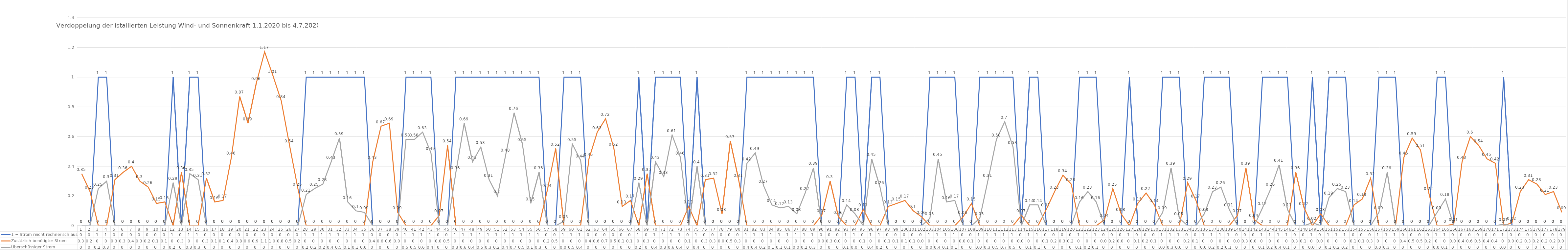
| Category | 1 = Strom reicht rechnerisch aus | Zusätzlich benötigter Strom | Überschüssiger Strom |
|---|---|---|---|
| 0 | 0 | 0.35 | 0 |
| 1 | 0 | 0.23 | 0 |
| 2 | 1 | 0 | 0.25 |
| 3 | 1 | 0 | 0.3 |
| 4 | 0 | 0.31 | 0 |
| 5 | 0 | 0.36 | 0 |
| 6 | 0 | 0.4 | 0 |
| 7 | 0 | 0.3 | 0 |
| 8 | 0 | 0.26 | 0 |
| 9 | 0 | 0.15 | 0 |
| 10 | 0 | 0.16 | 0 |
| 11 | 1 | 0 | 0.29 |
| 12 | 0 | 0.36 | 0 |
| 13 | 1 | 0 | 0.35 |
| 14 | 1 | 0 | 0.31 |
| 15 | 0 | 0.32 | 0 |
| 16 | 0 | 0.16 | 0 |
| 17 | 0 | 0.17 | 0 |
| 18 | 0 | 0.46 | 0 |
| 19 | 0 | 0.87 | 0 |
| 20 | 0 | 0.69 | 0 |
| 21 | 0 | 0.96 | 0 |
| 22 | 0 | 1.17 | 0 |
| 23 | 0 | 1.01 | 0 |
| 24 | 0 | 0.84 | 0 |
| 25 | 0 | 0.54 | 0 |
| 26 | 0 | 0.25 | 0 |
| 27 | 1 | 0 | 0.21 |
| 28 | 1 | 0 | 0.25 |
| 29 | 1 | 0 | 0.28 |
| 30 | 1 | 0 | 0.43 |
| 31 | 1 | 0 | 0.59 |
| 32 | 1 | 0 | 0.16 |
| 33 | 1 | 0 | 0.1 |
| 34 | 1 | 0 | 0.09 |
| 35 | 0 | 0.43 | 0 |
| 36 | 0 | 0.67 | 0 |
| 37 | 0 | 0.69 | 0 |
| 38 | 0 | 0.09 | 0 |
| 39 | 1 | 0 | 0.58 |
| 40 | 1 | 0 | 0.58 |
| 41 | 1 | 0 | 0.63 |
| 42 | 1 | 0 | 0.49 |
| 43 | 0 | 0.07 | 0 |
| 44 | 0 | 0.54 | 0 |
| 45 | 1 | 0 | 0.36 |
| 46 | 1 | 0 | 0.69 |
| 47 | 1 | 0 | 0.43 |
| 48 | 1 | 0 | 0.53 |
| 49 | 1 | 0 | 0.31 |
| 50 | 1 | 0 | 0.2 |
| 51 | 1 | 0 | 0.48 |
| 52 | 1 | 0 | 0.76 |
| 53 | 1 | 0 | 0.55 |
| 54 | 1 | 0 | 0.15 |
| 55 | 1 | 0 | 0.36 |
| 56 | 0 | 0.24 | 0 |
| 57 | 0 | 0.52 | 0 |
| 58 | 1 | 0 | 0.03 |
| 59 | 1 | 0 | 0.55 |
| 60 | 1 | 0 | 0.44 |
| 61 | 0 | 0.45 | 0 |
| 62 | 0 | 0.63 | 0 |
| 63 | 0 | 0.72 | 0 |
| 64 | 0 | 0.52 | 0 |
| 65 | 0 | 0.13 | 0 |
| 66 | 0 | 0.17 | 0 |
| 67 | 1 | 0 | 0.29 |
| 68 | 0 | 0.35 | 0 |
| 69 | 1 | 0 | 0.43 |
| 70 | 1 | 0 | 0.33 |
| 71 | 1 | 0 | 0.61 |
| 72 | 1 | 0 | 0.46 |
| 73 | 0 | 0.13 | 0 |
| 74 | 1 | 0 | 0.4 |
| 75 | 0 | 0.31 | 0 |
| 76 | 0 | 0.32 | 0 |
| 77 | 0 | 0.08 | 0 |
| 78 | 0 | 0.57 | 0 |
| 79 | 0 | 0.31 | 0 |
| 80 | 1 | 0 | 0.42 |
| 81 | 1 | 0 | 0.49 |
| 82 | 1 | 0 | 0.27 |
| 83 | 1 | 0 | 0.14 |
| 84 | 1 | 0 | 0.12 |
| 85 | 1 | 0 | 0.13 |
| 86 | 1 | 0 | 0.08 |
| 87 | 1 | 0 | 0.22 |
| 88 | 1 | 0 | 0.39 |
| 89 | 0 | 0.07 | 0 |
| 90 | 0 | 0.3 | 0 |
| 91 | 0 | 0.06 | 0 |
| 92 | 1 | 0 | 0.14 |
| 93 | 1 | 0 | 0.08 |
| 94 | 0 | 0.11 | 0 |
| 95 | 1 | 0 | 0.45 |
| 96 | 1 | 0 | 0.26 |
| 97 | 0 | 0.13 | 0 |
| 98 | 0 | 0.15 | 0 |
| 99 | 0 | 0.17 | 0 |
| 100 | 0 | 0.1 | 0 |
| 101 | 0 | 0.06 | 0 |
| 102 | 1 | 0 | 0.05 |
| 103 | 1 | 0 | 0.45 |
| 104 | 1 | 0 | 0.16 |
| 105 | 1 | 0 | 0.17 |
| 106 | 0 | 0.06 | 0 |
| 107 | 0 | 0.15 | 0 |
| 108 | 1 | 0 | 0.05 |
| 109 | 1 | 0 | 0.31 |
| 110 | 1 | 0 | 0.58 |
| 111 | 1 | 0 | 0.7 |
| 112 | 1 | 0 | 0.53 |
| 113 | 0 | 0.07 | 0 |
| 114 | 1 | 0 | 0.14 |
| 115 | 1 | 0 | 0.14 |
| 116 | 0 | 0.11 | 0 |
| 117 | 0 | 0.23 | 0 |
| 118 | 0 | 0.34 | 0 |
| 119 | 0 | 0.28 | 0 |
| 120 | 1 | 0 | 0.16 |
| 121 | 1 | 0 | 0.23 |
| 122 | 1 | 0 | 0.16 |
| 123 | 0 | 0.04 | 0 |
| 124 | 0 | 0.25 | 0 |
| 125 | 0 | 0.08 | 0 |
| 126 | 1 | 0 | 0 |
| 127 | 0 | 0.15 | 0 |
| 128 | 0 | 0.22 | 0 |
| 129 | 0 | 0.14 | 0 |
| 130 | 1 | 0 | 0.09 |
| 131 | 1 | 0 | 0.39 |
| 132 | 1 | 0 | 0.05 |
| 133 | 0 | 0.29 | 0 |
| 134 | 0 | 0.17 | 0 |
| 135 | 1 | 0 | 0.08 |
| 136 | 1 | 0 | 0.23 |
| 137 | 1 | 0 | 0.26 |
| 138 | 1 | 0 | 0.11 |
| 139 | 0 | 0.07 | 0 |
| 140 | 0 | 0.39 | 0 |
| 141 | 0 | 0.04 | 0 |
| 142 | 1 | 0 | 0.12 |
| 143 | 1 | 0 | 0.25 |
| 144 | 1 | 0 | 0.41 |
| 145 | 1 | 0 | 0.11 |
| 146 | 0 | 0.36 | 0 |
| 147 | 0 | 0.12 | 0 |
| 148 | 1 | 0 | 0.02 |
| 149 | 0 | 0.08 | 0 |
| 150 | 1 | 0 | 0.19 |
| 151 | 1 | 0 | 0.25 |
| 152 | 1 | 0 | 0.23 |
| 153 | 0 | 0.14 | 0 |
| 154 | 0 | 0.18 | 0 |
| 155 | 0 | 0.32 | 0 |
| 156 | 1 | 0 | 0.09 |
| 157 | 1 | 0 | 0.36 |
| 158 | 1 | 0 | 0 |
| 159 | 0 | 0.46 | 0 |
| 160 | 0 | 0.59 | 0 |
| 161 | 0 | 0.51 | 0 |
| 162 | 0 | 0.22 | 0 |
| 163 | 1 | 0 | 0.09 |
| 164 | 1 | 0 | 0.18 |
| 165 | 0 | 0.01 | 0 |
| 166 | 0 | 0.43 | 0 |
| 167 | 0 | 0.6 | 0 |
| 168 | 0 | 0.54 | 0 |
| 169 | 0 | 0.45 | 0 |
| 170 | 0 | 0.42 | 0 |
| 171 | 1 | 0 | 0.01 |
| 172 | 0 | 0.02 | 0 |
| 173 | 0 | 0.23 | 0 |
| 174 | 0 | 0.31 | 0 |
| 175 | 0 | 0.28 | 0 |
| 176 | 0 | 0.21 | 0 |
| 177 | 0 | 0.23 | 0 |
| 178 | 0 | 0.09 | 0 |